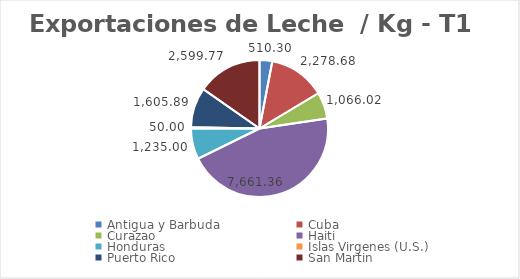
| Category | kg | Valor US  |
|---|---|---|
| Antigua y Barbuda | 510.3 | 639 |
| Cuba | 2278.68 | 6662.6 |
| Curazao | 1066.02 | 2065.05 |
| Haiti | 7661.36 | 18638.239 |
| Honduras | 1235 | 1454.85 |
| Islas Virgenes (U.S.) | 50 | 639 |
| Puerto Rico | 1605.89 | 7481.46 |
| San Martin | 2599.77 | 3351.72 |